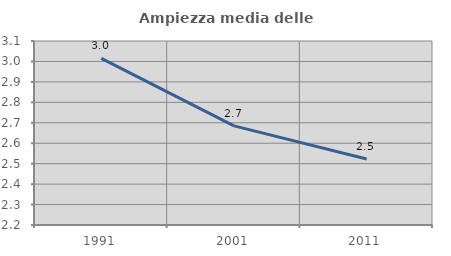
| Category | Ampiezza media delle famiglie |
|---|---|
| 1991.0 | 3.015 |
| 2001.0 | 2.685 |
| 2011.0 | 2.523 |